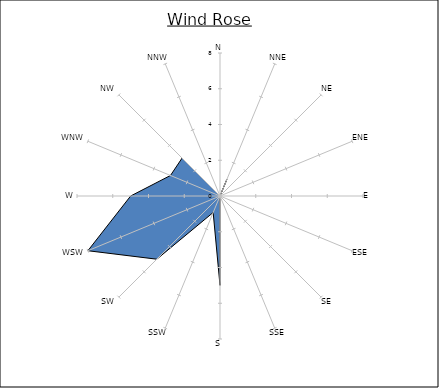
| Category | Series 0 |
|---|---|
| N | 0 |
| NNE | 1 |
| NE | 0 |
| ENE | 0 |
| E | 0 |
| ESE | 0 |
| SE | 0 |
| SSE | 0 |
| S | 5 |
| SSW | 1 |
| SW | 5 |
| WSW | 8 |
| W | 5 |
| WNW | 3 |
| NW | 3 |
| NNW | 0 |